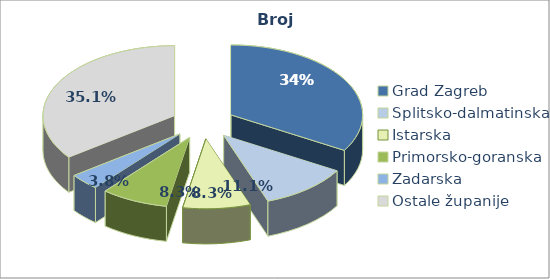
| Category | Broj poduzetnika | Udio u RH ( u %) |
|---|---|---|
| Grad Zagreb | 45608 | 33.471 |
| Splitsko-dalmatinska | 15077 | 11.065 |
| Istarska | 11291 | 8.286 |
| Primorsko-goranska | 11261 | 8.264 |
| Zadarska | 5144 | 3.775 |
| Ostale županije | 47879 | 35.138 |